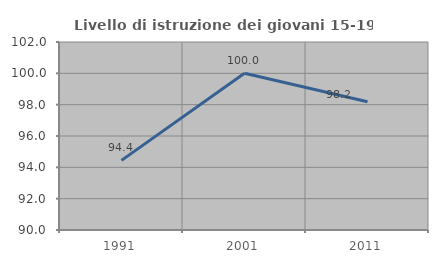
| Category | Livello di istruzione dei giovani 15-19 anni |
|---|---|
| 1991.0 | 94.444 |
| 2001.0 | 100 |
| 2011.0 | 98.182 |